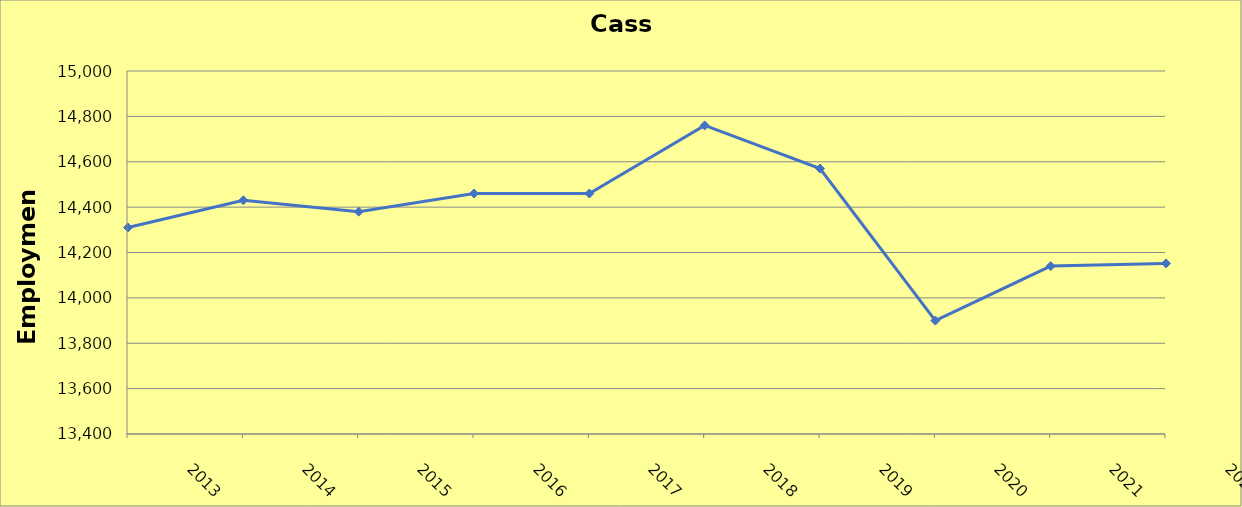
| Category | Cass County |
|---|---|
| 2013.0 | 14310 |
| 2014.0 | 14430 |
| 2015.0 | 14380 |
| 2016.0 | 14460 |
| 2017.0 | 14460 |
| 2018.0 | 14760 |
| 2019.0 | 14570 |
| 2020.0 | 13900 |
| 2021.0 | 14140 |
| 2022.0 | 14152 |